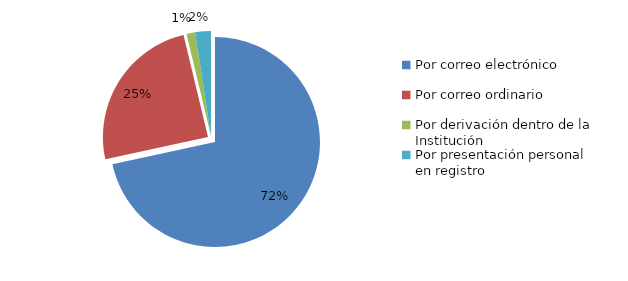
| Category | Series 0 |
|---|---|
| Por correo electrónico  | 325 |
| Por correo ordinario | 112 |
| Por derivación dentro de la Institución | 6 |
| Por FAX | 0 |
| Por presentación personal en registro | 11 |